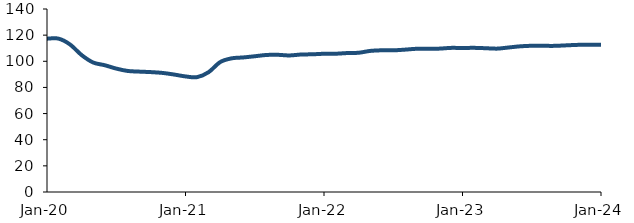
| Category | Series 0 |
|---|---|
| 2020-01-01 | 117.309 |
| 2020-02-01 | 117.318 |
| 2020-03-01 | 112.843 |
| 2020-04-01 | 104.749 |
| 2020-05-01 | 99.065 |
| 2020-06-01 | 97 |
| 2020-07-01 | 94.403 |
| 2020-08-01 | 92.588 |
| 2020-09-01 | 92.095 |
| 2020-10-01 | 91.72 |
| 2020-11-01 | 91.108 |
| 2020-12-01 | 89.884 |
| 2021-01-01 | 88.42 |
| 2021-02-01 | 87.87 |
| 2021-03-01 | 91.662 |
| 2021-04-01 | 99.36 |
| 2021-05-01 | 102.252 |
| 2021-06-01 | 102.937 |
| 2021-07-01 | 103.85 |
| 2021-08-01 | 104.82 |
| 2021-09-01 | 104.952 |
| 2021-10-01 | 104.465 |
| 2021-11-01 | 105.171 |
| 2021-12-01 | 105.344 |
| 2022-01-01 | 105.752 |
| 2022-02-01 | 105.784 |
| 2022-03-01 | 106.289 |
| 2022-04-01 | 106.52 |
| 2022-05-01 | 107.933 |
| 2022-06-01 | 108.418 |
| 2022-07-01 | 108.373 |
| 2022-08-01 | 108.898 |
| 2022-09-01 | 109.553 |
| 2022-10-01 | 109.61 |
| 2022-11-01 | 109.687 |
| 2022-12-01 | 110.251 |
| 2023-01-01 | 110.176 |
| 2023-02-01 | 110.279 |
| 2023-03-01 | 110.001 |
| 2023-04-01 | 109.685 |
| 2023-05-01 | 110.559 |
| 2023-06-01 | 111.451 |
| 2023-07-01 | 111.863 |
| 2023-08-01 | 111.819 |
| 2023-09-01 | 111.804 |
| 2023-10-01 | 112.194 |
| 2023-11-01 | 112.565 |
| 2023-12-01 | 112.585 |
| 2024-01-01 | 112.572 |